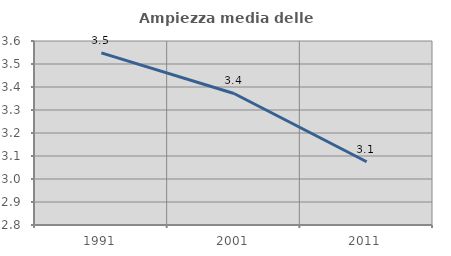
| Category | Ampiezza media delle famiglie |
|---|---|
| 1991.0 | 3.548 |
| 2001.0 | 3.372 |
| 2011.0 | 3.075 |